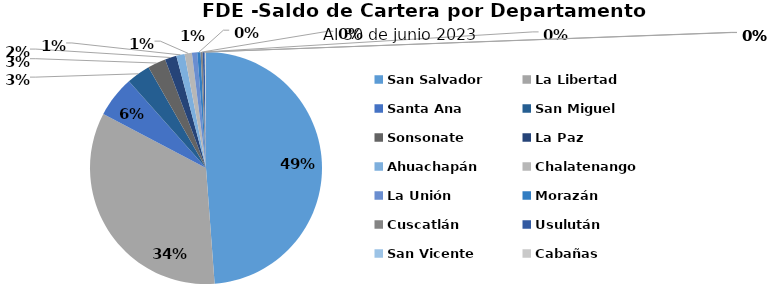
| Category | Saldo |
|---|---|
| San Salvador | 24.833 |
| La Libertad | 17.238 |
| Santa Ana | 2.912 |
| San Miguel | 1.687 |
| Sonsonate | 1.283 |
| La Paz | 0.82 |
| Ahuachapán | 0.592 |
| Chalatenango | 0.515 |
| La Unión | 0.378 |
| Morazán | 0.235 |
| Cuscatlán | 0.147 |
| Usulután | 0.141 |
| San Vicente | 0.049 |
| Cabañas | 0.04 |